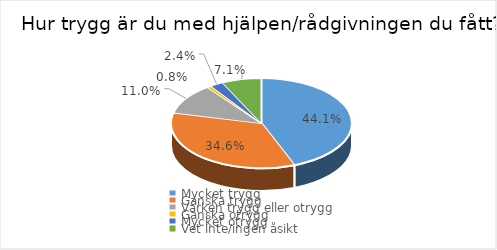
| Category | Series 0 |
|---|---|
| Mycket trygg | 0.441 |
| Ganska trygg | 0.346 |
| Varken trygg eller otrygg | 0.11 |
| Ganska otrygg | 0.008 |
| Mycket otrygg | 0.024 |
| Vet inte/ingen åsikt | 0.071 |